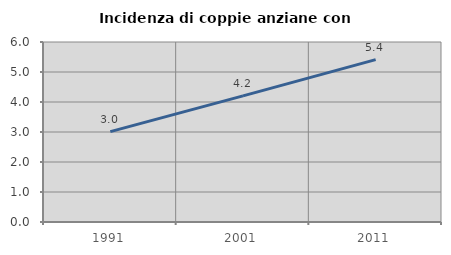
| Category | Incidenza di coppie anziane con figli |
|---|---|
| 1991.0 | 3.014 |
| 2001.0 | 4.204 |
| 2011.0 | 5.412 |